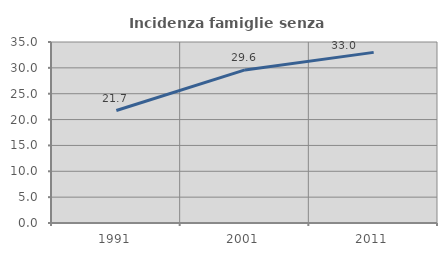
| Category | Incidenza famiglie senza nuclei |
|---|---|
| 1991.0 | 21.743 |
| 2001.0 | 29.607 |
| 2011.0 | 32.993 |